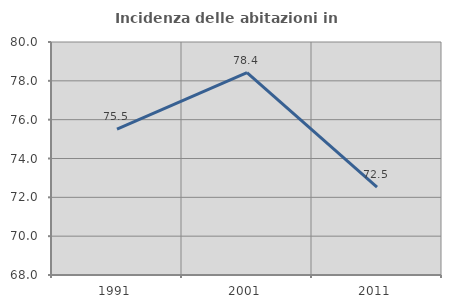
| Category | Incidenza delle abitazioni in proprietà  |
|---|---|
| 1991.0 | 75.514 |
| 2001.0 | 78.422 |
| 2011.0 | 72.526 |